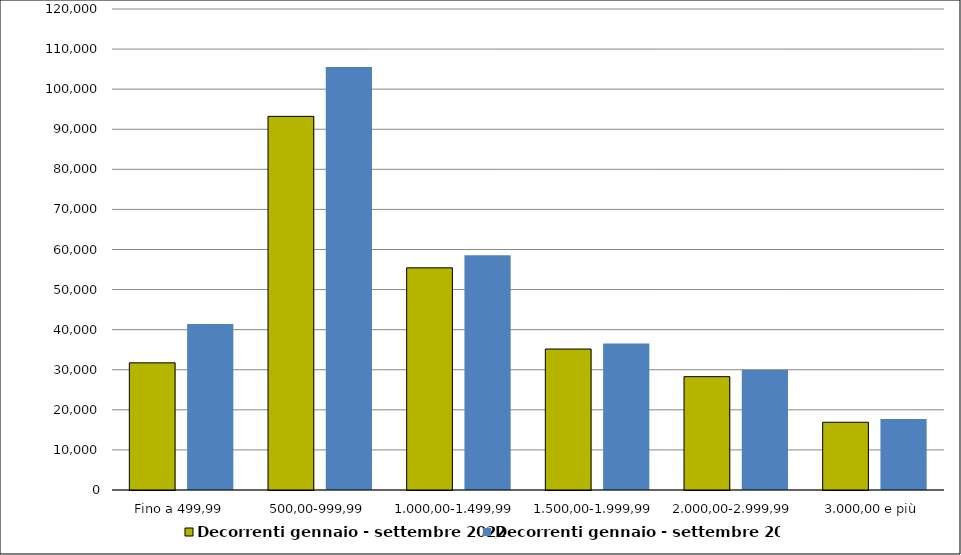
| Category | Decorrenti gennaio - settembre 2022 | Decorrenti gennaio - settembre 2021 |
|---|---|---|
| Fino a 499,99 | 31724 | 41425 |
| 500,00-999,99 | 93213 | 105550 |
| 1.000,00-1.499,99 | 55421 | 58575 |
| 1.500,00-1.999,99 | 35168 | 36519 |
| 2.000,00-2.999,99 | 28278 | 29976 |
| 3.000,00 e più | 16902 | 17693 |